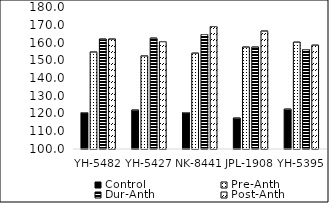
| Category | Control | Pre-Anth | Dur-Anth | Post-Anth |
|---|---|---|---|---|
| YH-5482 | 120.5 | 154.7 | 162 | 162 |
| YH-5427 | 122 | 152.5 | 162.5 | 160.5 |
| NK-8441 | 120.5 | 154 | 164.5 | 169 |
| JPL-1908 | 117.5 | 157.5 | 157.5 | 166.5 |
| YH-5395 | 122.5 | 160.2 | 156 | 158.5 |